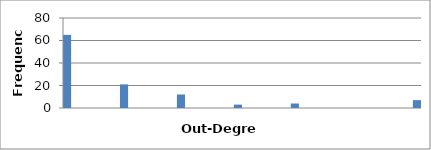
| Category | 65 |
|---|---|
| 1.0 | 65 |
| 1.1395348837209303 | 0 |
| 1.2790697674418605 | 0 |
| 1.4186046511627908 | 0 |
| 1.558139534883721 | 0 |
| 1.6976744186046513 | 0 |
| 1.8372093023255816 | 0 |
| 1.9767441860465118 | 21 |
| 2.116279069767442 | 0 |
| 2.255813953488372 | 0 |
| 2.395348837209302 | 0 |
| 2.534883720930232 | 0 |
| 2.674418604651162 | 0 |
| 2.8139534883720922 | 0 |
| 2.9534883720930223 | 12 |
| 3.0930232558139523 | 0 |
| 3.2325581395348824 | 0 |
| 3.3720930232558124 | 0 |
| 3.5116279069767424 | 0 |
| 3.6511627906976725 | 0 |
| 3.7906976744186025 | 0 |
| 3.9302325581395325 | 3 |
| 4.069767441860463 | 0 |
| 4.209302325581393 | 0 |
| 4.3488372093023235 | 0 |
| 4.488372093023254 | 0 |
| 4.6279069767441845 | 0 |
| 4.767441860465115 | 0 |
| 4.9069767441860455 | 4 |
| 5.046511627906976 | 0 |
| 5.186046511627906 | 0 |
| 5.325581395348837 | 0 |
| 5.465116279069767 | 0 |
| 5.604651162790698 | 0 |
| 5.744186046511628 | 0 |
| 5.883720930232559 | 0 |
| 6.023255813953489 | 0 |
| 6.16279069767442 | 0 |
| 6.30232558139535 | 0 |
| 6.441860465116281 | 0 |
| 6.581395348837211 | 0 |
| 6.720930232558142 | 0 |
| 6.860465116279072 | 0 |
| 7.0 | 7 |